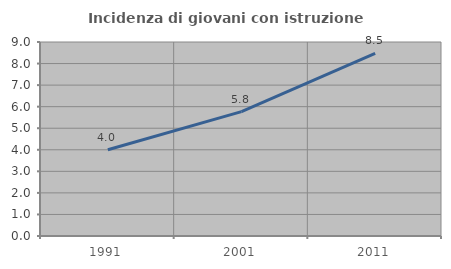
| Category | Incidenza di giovani con istruzione universitaria |
|---|---|
| 1991.0 | 4 |
| 2001.0 | 5.769 |
| 2011.0 | 8.475 |